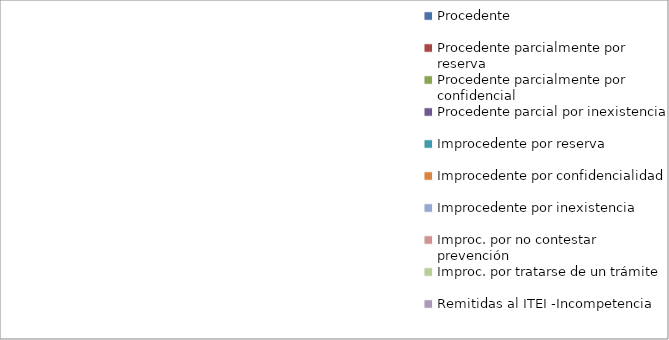
| Category | Series 0 |
|---|---|
| Procedente | 0 |
| Procedente parcialmente por reserva  | 0 |
| Procedente parcialmente por confidencial | 0 |
| Procedente parcial por inexistencia | 0 |
| Improcedente por reserva  | 0 |
| Improcedente por confidencialidad | 0 |
| Improcedente por inexistencia  | 0 |
| Improc. por no contestar prevención | 0 |
| Improc. por tratarse de un trámite  | 0 |
| Remitidas al ITEI -Incompetencia  | 0 |